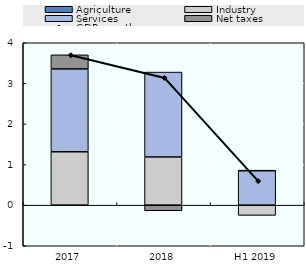
| Category | Agriculture | Industry | Services | Net taxes |
|---|---|---|---|---|
| 2017 | -0.003 | 1.315 | 2.039 | 0.349 |
| 2018 | 0 | 1.187 | 2.091 | -0.138 |
| H1 2019 | 0 | -0.252 | 0.85 | 0.005 |